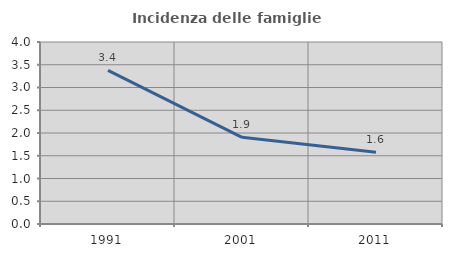
| Category | Incidenza delle famiglie numerose |
|---|---|
| 1991.0 | 3.378 |
| 2001.0 | 1.904 |
| 2011.0 | 1.579 |